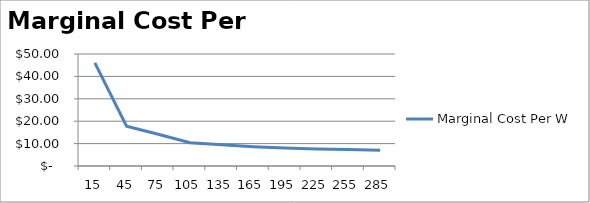
| Category | Marginal Cost Per W |
|---|---|
| 15.0 | 46.032 |
| 45.0 | 17.759 |
| 75.0 | 14.152 |
| 105.0 | 10.413 |
| 135.0 | 9.473 |
| 165.0 | 8.642 |
| 195.0 | 8.066 |
| 225.0 | 7.645 |
| 255.0 | 7.322 |
| 285.0 | 7.067 |